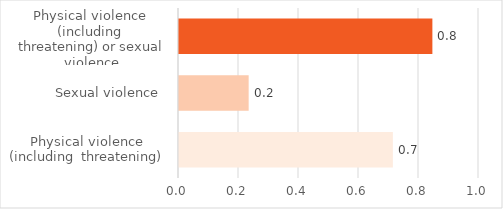
| Category | Series 0 |
|---|---|
| Physical violence
(including  threatening) | 0.713 |
| Sexual violence  | 0.232 |
| Physical violence  (including 
threatening) or sexual violence | 0.845 |